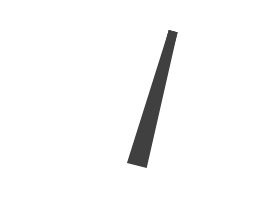
| Category | B |
|---|---|
| 62.74202838698339 | 48.349 |
| 51.93396616830194 | -0.51 |
| 48.06603383169806 | 0.51 |
| 62.74202838698339 | 48.349 |
| 50.0 | 0 |